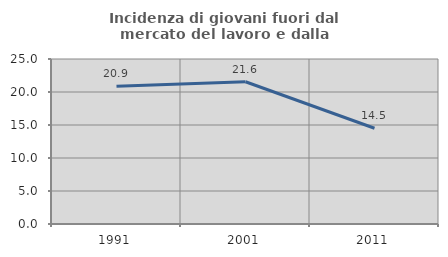
| Category | Incidenza di giovani fuori dal mercato del lavoro e dalla formazione  |
|---|---|
| 1991.0 | 20.884 |
| 2001.0 | 21.558 |
| 2011.0 | 14.504 |